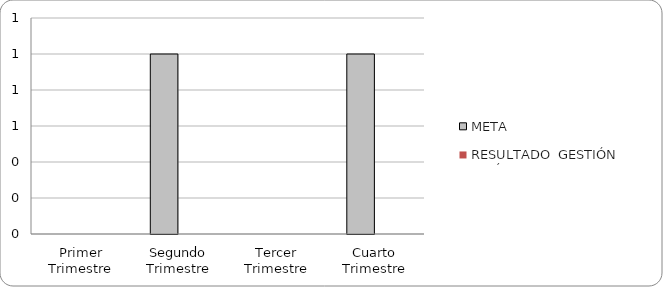
| Category | META | RESULTADO  GESTIÓN PERÍODO |
|---|---|---|
| Primer Trimestre | 0 | 0 |
| Segundo Trimestre | 1 | 0 |
| Tercer Trimestre | 0 | 0 |
| Cuarto Trimestre | 1 | 0 |